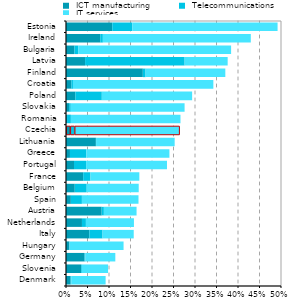
| Category |  ICT manufacturing |  Telecommunications |  IT services |
|---|---|---|---|
| Denmark | 0.011 | 0.002 | 0.08 |
| Slovenia | 0.035 | 0.002 | 0.061 |
| Germany | 0.043 | 0.002 | 0.069 |
| Hungary | 0.008 | 0.001 | 0.125 |
| Italy | 0.054 | 0.031 | 0.073 |
| Netherlands | 0.037 | 0.009 | 0.112 |
| Austria | 0.083 | 0.005 | 0.076 |
| Spain | 0.011 | 0.026 | 0.132 |
| Belgium | 0.02 | 0.028 | 0.121 |
| France | 0.04 | 0.017 | 0.114 |
| Portugal | 0.019 | 0.028 | 0.188 |
| Greece | 0.009 | 0.038 | 0.193 |
| Lithuania | 0.069 | 0 | 0.183 |
| Czechia | 0.009 | 0.01 | 0.244 |
| Romania | 0.002 | 0.009 | 0.255 |
| Slovakia | 0.007 | 0.004 | 0.265 |
| Poland | 0.022 | 0.062 | 0.21 |
| Croatia | 0.012 | 0.004 | 0.326 |
| Finland | 0.179 | 0.006 | 0.185 |
| Latvia | 0.044 | 0.231 | 0.1 |
| Bulgaria | 0.02 | 0.009 | 0.355 |
| Ireland | 0.08 | 0.006 | 0.344 |
| Estonia | 0.108 | 0.046 | 0.338 |